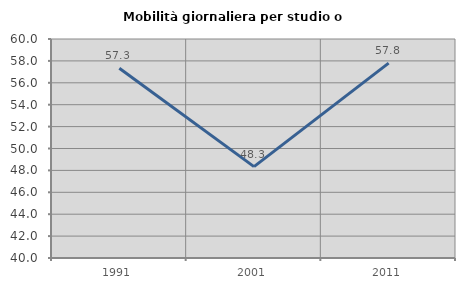
| Category | Mobilità giornaliera per studio o lavoro |
|---|---|
| 1991.0 | 57.33 |
| 2001.0 | 48.344 |
| 2011.0 | 57.801 |